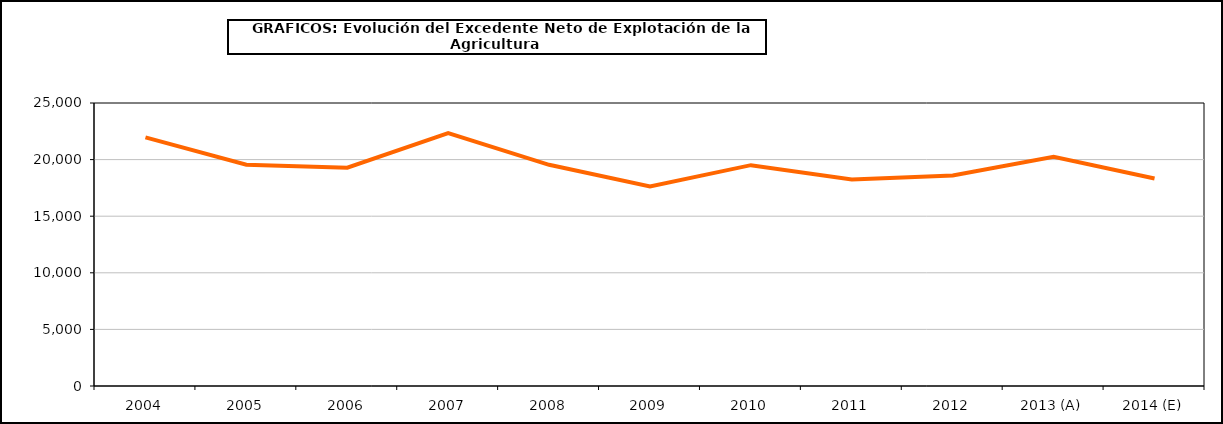
| Category | excedente neto de explotacion |
|---|---|
| 2004 | 21967.209 |
| 2005 | 19553.083 |
| 2006 | 19287.489 |
| 2007 | 22333.308 |
| 2008 | 19538.087 |
| 2009 | 17624.014 |
| 2010 | 19508.768 |
| 2011 | 18252.686 |
| 2012 | 18589.082 |
| 2013 (A) | 20238.996 |
| 2014 (E) | 18325.576 |